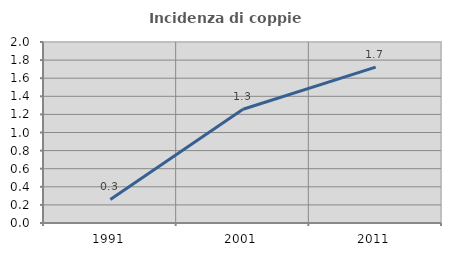
| Category | Incidenza di coppie miste |
|---|---|
| 1991.0 | 0.26 |
| 2001.0 | 1.257 |
| 2011.0 | 1.723 |